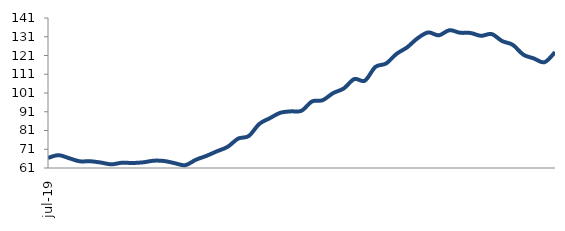
| Category | Series 0 |
|---|---|
| 2019-07-01 | 66.392 |
| 2019-08-01 | 67.837 |
| 2019-09-01 | 66.22 |
| 2019-10-01 | 64.573 |
| 2019-11-01 | 64.608 |
| 2019-12-01 | 63.908 |
| 2020-01-01 | 62.959 |
| 2020-02-01 | 63.811 |
| 2020-03-01 | 63.665 |
| 2020-04-01 | 64.013 |
| 2020-05-01 | 64.885 |
| 2020-06-01 | 64.73 |
| 2020-07-01 | 63.568 |
| 2020-08-01 | 62.507 |
| 2020-09-01 | 65.409 |
| 2020-10-01 | 67.466 |
| 2020-11-01 | 69.929 |
| 2020-12-01 | 72.262 |
| 2021-01-01 | 76.667 |
| 2021-02-01 | 78.05 |
| 2021-03-01 | 84.474 |
| 2021-04-01 | 87.564 |
| 2021-05-01 | 90.47 |
| 2021-06-01 | 91.204 |
| 2021-07-01 | 91.538 |
| 2021-08-01 | 96.497 |
| 2021-09-01 | 97.152 |
| 2021-10-01 | 100.957 |
| 2021-11-01 | 103.422 |
| 2021-12-01 | 108.432 |
| 2022-01-01 | 107.584 |
| 2022-02-01 | 114.937 |
| 2022-03-01 | 116.708 |
| 2022-04-01 | 121.877 |
| 2022-05-01 | 125.358 |
| 2022-06-01 | 130.237 |
| 2022-07-01 | 133.304 |
| 2022-08-01 | 131.751 |
| 2022-09-01 | 134.487 |
| 2022-10-01 | 133.139 |
| 2022-11-01 | 133.012 |
| 2022-12-01 | 131.496 |
| 2023-01-01 | 132.43 |
| 2023-02-01 | 128.69 |
| 2023-03-01 | 126.696 |
| 2023-04-01 | 121.465 |
| 2023-05-01 | 119.417 |
| 2023-06-01 | 117.407 |
| 2023-07-01 | 122.739 |